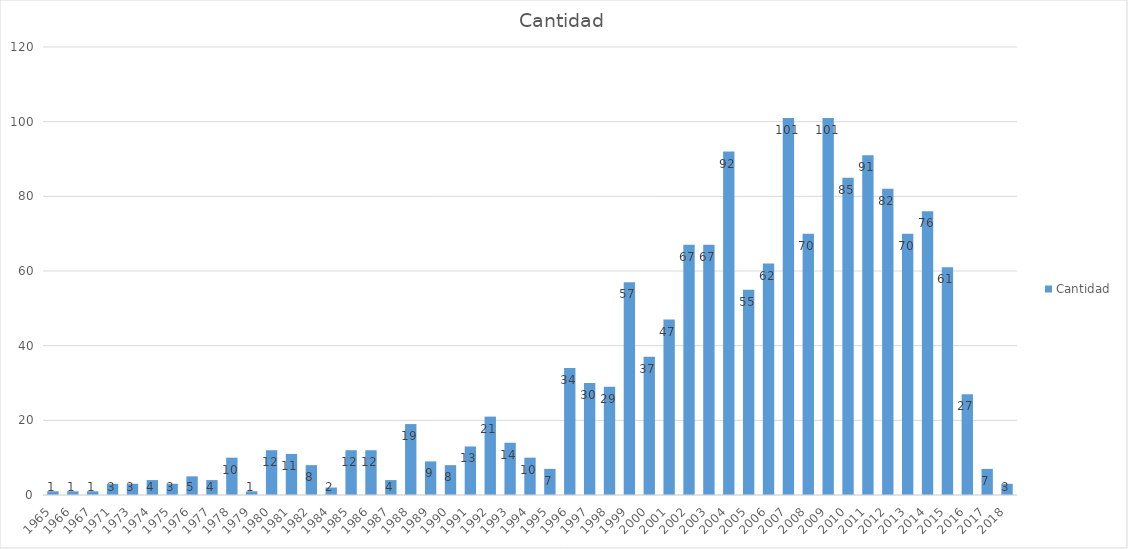
| Category | Cantidad |
|---|---|
| 1965.0 | 1 |
| 1966.0 | 1 |
| 1967.0 | 1 |
| 1971.0 | 3 |
| 1973.0 | 3 |
| 1974.0 | 4 |
| 1975.0 | 3 |
| 1976.0 | 5 |
| 1977.0 | 4 |
| 1978.0 | 10 |
| 1979.0 | 1 |
| 1980.0 | 12 |
| 1981.0 | 11 |
| 1982.0 | 8 |
| 1984.0 | 2 |
| 1985.0 | 12 |
| 1986.0 | 12 |
| 1987.0 | 4 |
| 1988.0 | 19 |
| 1989.0 | 9 |
| 1990.0 | 8 |
| 1991.0 | 13 |
| 1992.0 | 21 |
| 1993.0 | 14 |
| 1994.0 | 10 |
| 1995.0 | 7 |
| 1996.0 | 34 |
| 1997.0 | 30 |
| 1998.0 | 29 |
| 1999.0 | 57 |
| 2000.0 | 37 |
| 2001.0 | 47 |
| 2002.0 | 67 |
| 2003.0 | 67 |
| 2004.0 | 92 |
| 2005.0 | 55 |
| 2006.0 | 62 |
| 2007.0 | 101 |
| 2008.0 | 70 |
| 2009.0 | 101 |
| 2010.0 | 85 |
| 2011.0 | 91 |
| 2012.0 | 82 |
| 2013.0 | 70 |
| 2014.0 | 76 |
| 2015.0 | 61 |
| 2016.0 | 27 |
| 2017.0 | 7 |
| 2018.0 | 3 |